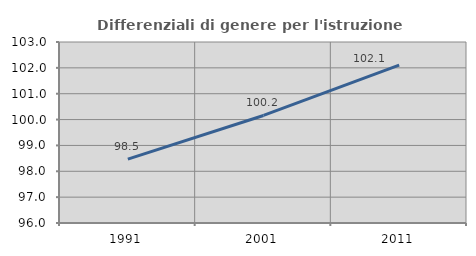
| Category | Differenziali di genere per l'istruzione superiore |
|---|---|
| 1991.0 | 98.469 |
| 2001.0 | 100.159 |
| 2011.0 | 102.107 |